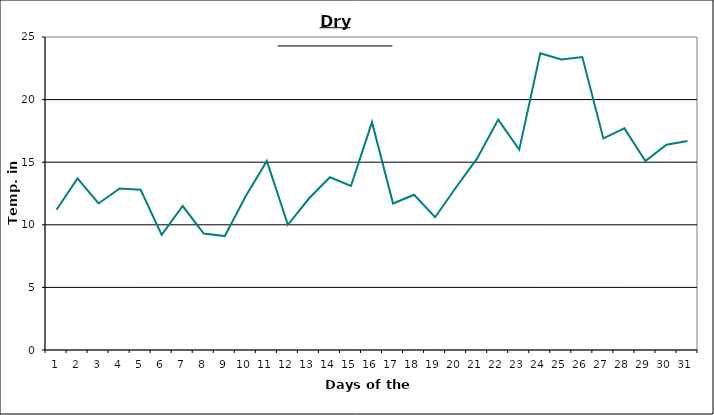
| Category | Series 0 |
|---|---|
| 0 | 11.2 |
| 1 | 13.7 |
| 2 | 11.7 |
| 3 | 12.9 |
| 4 | 12.8 |
| 5 | 9.2 |
| 6 | 11.5 |
| 7 | 9.3 |
| 8 | 9.1 |
| 9 | 12.3 |
| 10 | 15.1 |
| 11 | 10 |
| 12 | 12.1 |
| 13 | 13.8 |
| 14 | 13.1 |
| 15 | 18.2 |
| 16 | 11.7 |
| 17 | 12.4 |
| 18 | 10.6 |
| 19 | 13 |
| 20 | 15.3 |
| 21 | 18.4 |
| 22 | 16 |
| 23 | 23.7 |
| 24 | 23.2 |
| 25 | 23.4 |
| 26 | 16.9 |
| 27 | 17.7 |
| 28 | 15.1 |
| 29 | 16.4 |
| 30 | 16.7 |